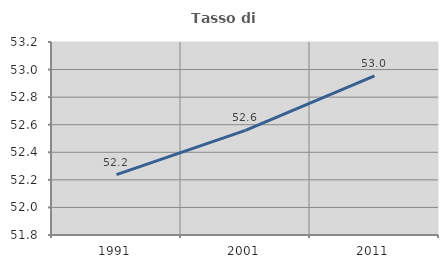
| Category | Tasso di occupazione   |
|---|---|
| 1991.0 | 52.238 |
| 2001.0 | 52.559 |
| 2011.0 | 52.954 |